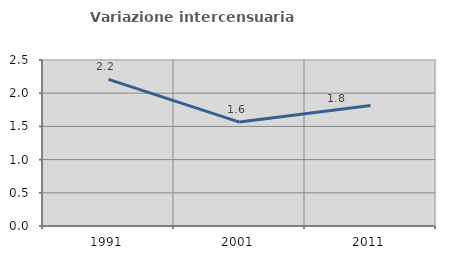
| Category | Variazione intercensuaria annua |
|---|---|
| 1991.0 | 2.208 |
| 2001.0 | 1.565 |
| 2011.0 | 1.813 |